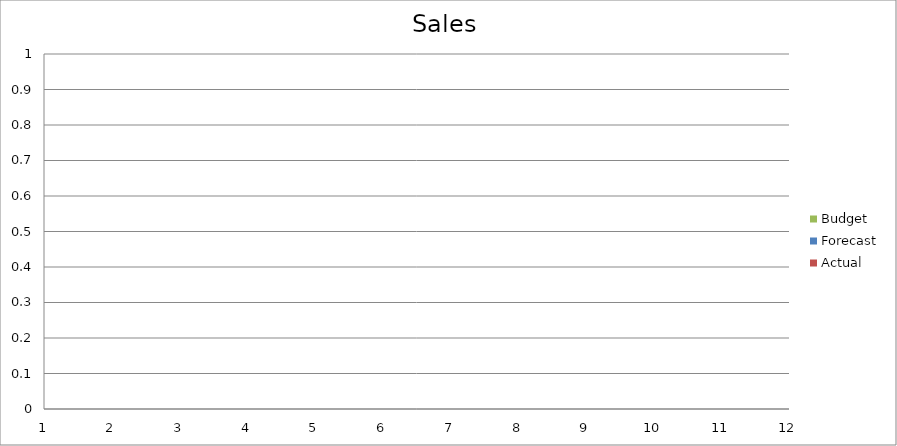
| Category | Budget | Forecast | Actual |
|---|---|---|---|
| 0 | 1870 | 2030 | 1710 |
| 1 | 3030 | 3110 | 1420 |
| 2 | 2290 | 1280 | 1540 |
| 3 | 1490 | 3450 | 2110 |
| 4 | 640 | 2740 | 1560 |
| 5 | 690 | 1900 | 2260 |
| 6 | 980 | 640 | 1410 |
| 7 | 1010 | 810 | 2930 |
| 8 | 1330 | 2540 | 1400 |
| 9 | 2110 | 2530 | 3270 |
| 10 | 1380 | 1550 | 3130 |
| 11 | 1370 | 1610 | 2580 |